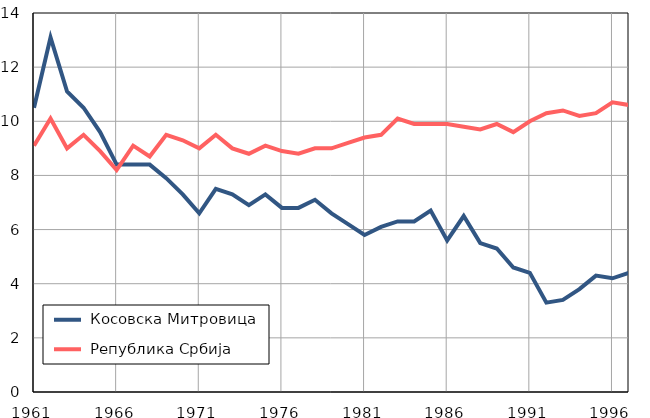
| Category |  Косовска Митровица |  Република Србија |
|---|---|---|
| 1961.0 | 10.5 | 9.1 |
| 1962.0 | 13.1 | 10.1 |
| 1963.0 | 11.1 | 9 |
| 1964.0 | 10.5 | 9.5 |
| 1965.0 | 9.6 | 8.9 |
| 1966.0 | 8.4 | 8.2 |
| 1967.0 | 8.4 | 9.1 |
| 1968.0 | 8.4 | 8.7 |
| 1969.0 | 7.9 | 9.5 |
| 1970.0 | 7.3 | 9.3 |
| 1971.0 | 6.6 | 9 |
| 1972.0 | 7.5 | 9.5 |
| 1973.0 | 7.3 | 9 |
| 1974.0 | 6.9 | 8.8 |
| 1975.0 | 7.3 | 9.1 |
| 1976.0 | 6.8 | 8.9 |
| 1977.0 | 6.8 | 8.8 |
| 1978.0 | 7.1 | 9 |
| 1979.0 | 6.6 | 9 |
| 1980.0 | 6.2 | 9.2 |
| 1981.0 | 5.8 | 9.4 |
| 1982.0 | 6.1 | 9.5 |
| 1983.0 | 6.3 | 10.1 |
| 1984.0 | 6.3 | 9.9 |
| 1985.0 | 6.7 | 9.9 |
| 1986.0 | 5.6 | 9.9 |
| 1987.0 | 6.5 | 9.8 |
| 1988.0 | 5.5 | 9.7 |
| 1989.0 | 5.3 | 9.9 |
| 1990.0 | 4.6 | 9.6 |
| 1991.0 | 4.4 | 10 |
| 1992.0 | 3.3 | 10.3 |
| 1993.0 | 3.4 | 10.4 |
| 1994.0 | 3.8 | 10.2 |
| 1995.0 | 4.3 | 10.3 |
| 1996.0 | 4.2 | 10.7 |
| 1997.0 | 4.4 | 10.6 |